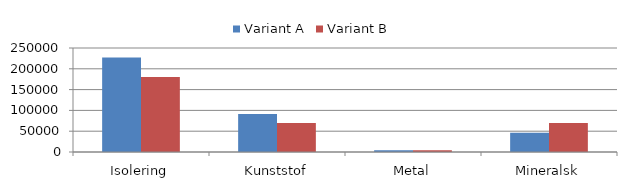
| Category | Variant A | Variant B |
|---|---|---|
| Isolering | 227082.36 | 180000 |
| Kunststof | 91319.38 | 70000 |
| Metal | 3997.39 | 4500 |
| Mineralsk | 46303.69 | 70000 |